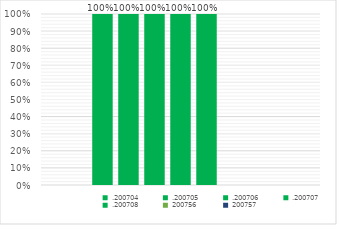
| Category | .200704 | .200705 | .200706 | .200707 | .200708 | 200756 | 200757 |
|---|---|---|---|---|---|---|---|
| 0 | 1 | 1 | 1 | 1 | 1 | 0 | 0 |